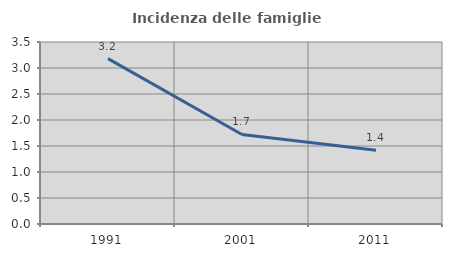
| Category | Incidenza delle famiglie numerose |
|---|---|
| 1991.0 | 3.181 |
| 2001.0 | 1.722 |
| 2011.0 | 1.42 |